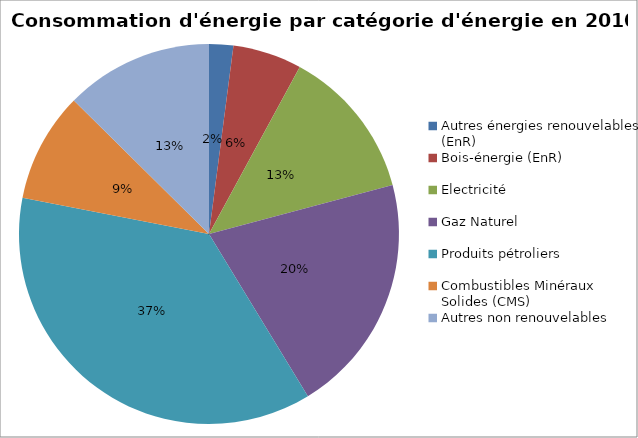
| Category | Series 0 |
|---|---|
| Autres énergies renouvelables (EnR) | 28188.677 |
| Bois-énergie (EnR) | 80299.529 |
| Electricité | 177000.897 |
| Gaz Naturel | 279633.766 |
| Produits pétroliers | 503344.117 |
| Combustibles Minéraux Solides (CMS) | 127931.451 |
| Autres non renouvelables | 172342.328 |